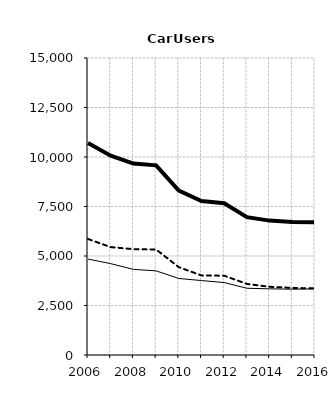
| Category | Built-up | Non built-up | Total |
|---|---|---|---|
| 2006.0 | 4846 | 5859 | 10705 |
| 2007.0 | 4614 | 5449 | 10063 |
| 2008.0 | 4325 | 5345 | 9670 |
| 2009.0 | 4249 | 5330 | 9579 |
| 2010.0 | 3865 | 4436 | 8301 |
| 2011.0 | 3759 | 4018 | 7777 |
| 2012.0 | 3660 | 4005 | 7665 |
| 2013.0 | 3371 | 3589 | 6960 |
| 2014.0 | 3342 | 3445 | 6787 |
| 2015.0 | 3324 | 3389 | 6713 |
| 2016.0 | 3336 | 3363 | 6699 |